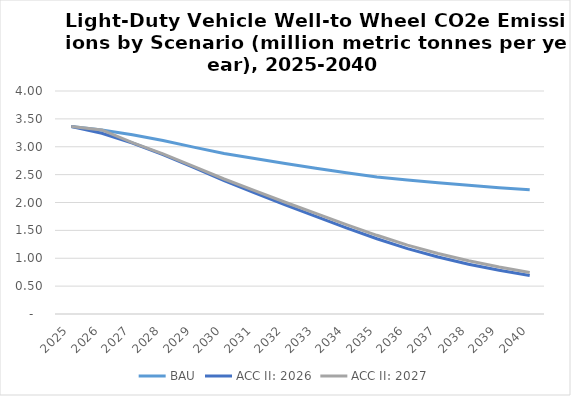
| Category | BAU | ACC II: 2026 | ACC II: 2027 |
|---|---|---|---|
| 2025.0 | 3.363 | 3.363 | 3.363 |
| 2026.0 | 3.301 | 3.241 | 3.301 |
| 2027.0 | 3.217 | 3.067 | 3.073 |
| 2028.0 | 3.112 | 2.859 | 2.872 |
| 2029.0 | 2.993 | 2.628 | 2.65 |
| 2030.0 | 2.878 | 2.391 | 2.421 |
| 2031.0 | 2.789 | 2.175 | 2.214 |
| 2032.0 | 2.7 | 1.958 | 2.004 |
| 2033.0 | 2.616 | 1.75 | 1.804 |
| 2034.0 | 2.535 | 1.544 | 1.602 |
| 2035.0 | 2.459 | 1.349 | 1.412 |
| 2036.0 | 2.404 | 1.172 | 1.236 |
| 2037.0 | 2.354 | 1.022 | 1.086 |
| 2038.0 | 2.308 | 0.893 | 0.955 |
| 2039.0 | 2.266 | 0.783 | 0.842 |
| 2040.0 | 2.229 | 0.691 | 0.744 |